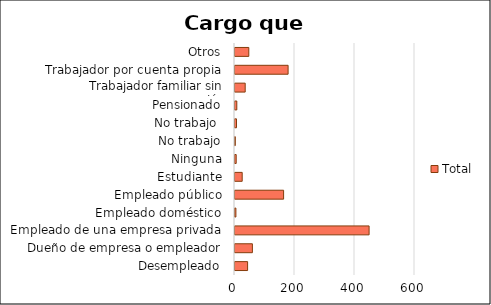
| Category | Total |
|---|---|
| Desempleado | 42 |
| Dueño de empresa o empleador | 58 |
| Empleado de una empresa privada | 447 |
| Empleado doméstico | 3 |
| Empleado público | 162 |
| Estudiante | 24 |
| Ninguna | 4 |
| No trabajo | 1 |
| No trabajo  | 5 |
| Pensionado | 6 |
| Trabajador familiar sin remuneración | 34 |
| Trabajador por cuenta propia | 177 |
| Otros | 46 |